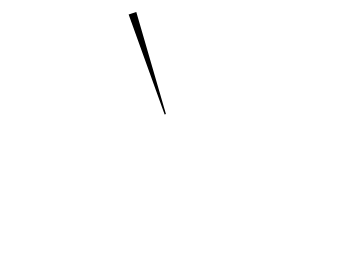
| Category | Series 0 |
|---|---|
| 0 | 39 |
| 1 | 0 |
| 2 | 2 |
| 3 | 59 |
| 4 | 0 |
| 5 | 0 |
| 6 | 0 |
| 7 | 0 |
| 8 | 0 |
| 9 | 0 |
| 10 | 100 |